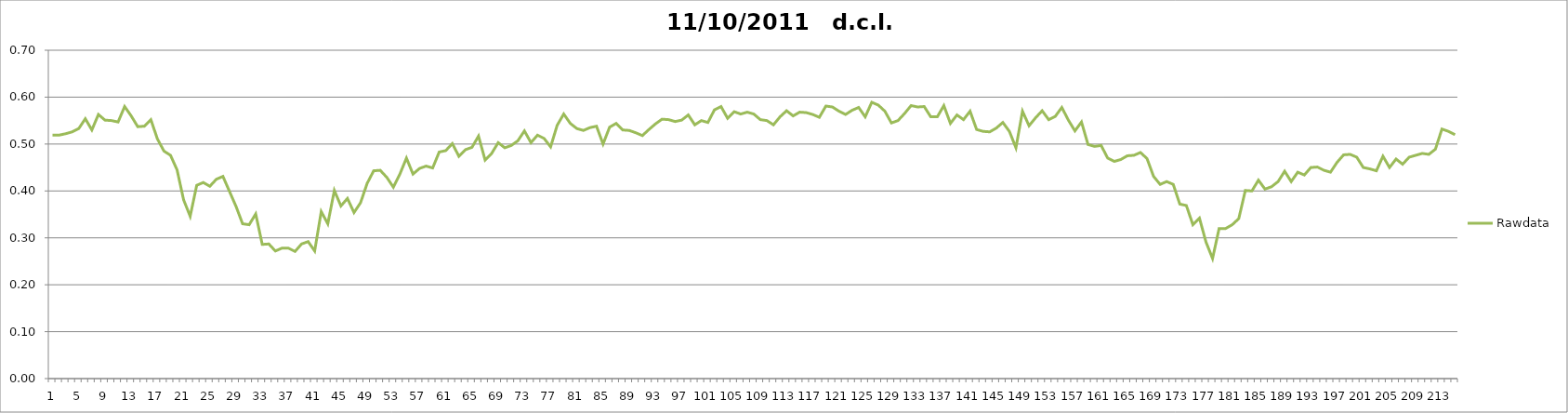
| Category | Rawdata |
|---|---|
| 0 | 0.519 |
| 1 | 0.519 |
| 2 | 0.522 |
| 3 | 0.526 |
| 4 | 0.533 |
| 5 | 0.554 |
| 6 | 0.53 |
| 7 | 0.563 |
| 8 | 0.551 |
| 9 | 0.55 |
| 10 | 0.547 |
| 11 | 0.58 |
| 12 | 0.56 |
| 13 | 0.537 |
| 14 | 0.538 |
| 15 | 0.552 |
| 16 | 0.511 |
| 17 | 0.485 |
| 18 | 0.476 |
| 19 | 0.445 |
| 20 | 0.381 |
| 21 | 0.346 |
| 22 | 0.412 |
| 23 | 0.418 |
| 24 | 0.41 |
| 25 | 0.425 |
| 26 | 0.431 |
| 27 | 0.399 |
| 28 | 0.367 |
| 29 | 0.33 |
| 30 | 0.328 |
| 31 | 0.351 |
| 32 | 0.286 |
| 33 | 0.287 |
| 34 | 0.272 |
| 35 | 0.278 |
| 36 | 0.278 |
| 37 | 0.271 |
| 38 | 0.287 |
| 39 | 0.292 |
| 40 | 0.272 |
| 41 | 0.356 |
| 42 | 0.33 |
| 43 | 0.401 |
| 44 | 0.368 |
| 45 | 0.384 |
| 46 | 0.354 |
| 47 | 0.375 |
| 48 | 0.416 |
| 49 | 0.443 |
| 50 | 0.444 |
| 51 | 0.429 |
| 52 | 0.408 |
| 53 | 0.436 |
| 54 | 0.47 |
| 55 | 0.436 |
| 56 | 0.448 |
| 57 | 0.453 |
| 58 | 0.449 |
| 59 | 0.483 |
| 60 | 0.486 |
| 61 | 0.501 |
| 62 | 0.474 |
| 63 | 0.488 |
| 64 | 0.493 |
| 65 | 0.517 |
| 66 | 0.466 |
| 67 | 0.48 |
| 68 | 0.503 |
| 69 | 0.492 |
| 70 | 0.497 |
| 71 | 0.507 |
| 72 | 0.528 |
| 73 | 0.503 |
| 74 | 0.519 |
| 75 | 0.512 |
| 76 | 0.494 |
| 77 | 0.54 |
| 78 | 0.564 |
| 79 | 0.544 |
| 80 | 0.533 |
| 81 | 0.529 |
| 82 | 0.535 |
| 83 | 0.538 |
| 84 | 0.5 |
| 85 | 0.536 |
| 86 | 0.544 |
| 87 | 0.53 |
| 88 | 0.529 |
| 89 | 0.524 |
| 90 | 0.518 |
| 91 | 0.531 |
| 92 | 0.543 |
| 93 | 0.553 |
| 94 | 0.552 |
| 95 | 0.548 |
| 96 | 0.551 |
| 97 | 0.562 |
| 98 | 0.541 |
| 99 | 0.55 |
| 100 | 0.546 |
| 101 | 0.573 |
| 102 | 0.58 |
| 103 | 0.555 |
| 104 | 0.569 |
| 105 | 0.564 |
| 106 | 0.568 |
| 107 | 0.564 |
| 108 | 0.552 |
| 109 | 0.55 |
| 110 | 0.541 |
| 111 | 0.558 |
| 112 | 0.571 |
| 113 | 0.56 |
| 114 | 0.568 |
| 115 | 0.567 |
| 116 | 0.563 |
| 117 | 0.557 |
| 118 | 0.581 |
| 119 | 0.579 |
| 120 | 0.57 |
| 121 | 0.563 |
| 122 | 0.572 |
| 123 | 0.578 |
| 124 | 0.558 |
| 125 | 0.589 |
| 126 | 0.583 |
| 127 | 0.57 |
| 128 | 0.545 |
| 129 | 0.55 |
| 130 | 0.565 |
| 131 | 0.582 |
| 132 | 0.579 |
| 133 | 0.58 |
| 134 | 0.558 |
| 135 | 0.558 |
| 136 | 0.582 |
| 137 | 0.544 |
| 138 | 0.562 |
| 139 | 0.552 |
| 140 | 0.57 |
| 141 | 0.531 |
| 142 | 0.527 |
| 143 | 0.526 |
| 144 | 0.534 |
| 145 | 0.546 |
| 146 | 0.527 |
| 147 | 0.492 |
| 148 | 0.57 |
| 149 | 0.539 |
| 150 | 0.556 |
| 151 | 0.571 |
| 152 | 0.552 |
| 153 | 0.559 |
| 154 | 0.578 |
| 155 | 0.551 |
| 156 | 0.528 |
| 157 | 0.547 |
| 158 | 0.499 |
| 159 | 0.495 |
| 160 | 0.497 |
| 161 | 0.47 |
| 162 | 0.463 |
| 163 | 0.467 |
| 164 | 0.475 |
| 165 | 0.476 |
| 166 | 0.482 |
| 167 | 0.469 |
| 168 | 0.431 |
| 169 | 0.414 |
| 170 | 0.42 |
| 171 | 0.414 |
| 172 | 0.372 |
| 173 | 0.369 |
| 174 | 0.328 |
| 175 | 0.342 |
| 176 | 0.291 |
| 177 | 0.256 |
| 178 | 0.32 |
| 179 | 0.32 |
| 180 | 0.328 |
| 181 | 0.341 |
| 182 | 0.401 |
| 183 | 0.4 |
| 184 | 0.423 |
| 185 | 0.404 |
| 186 | 0.409 |
| 187 | 0.42 |
| 188 | 0.442 |
| 189 | 0.42 |
| 190 | 0.44 |
| 191 | 0.434 |
| 192 | 0.45 |
| 193 | 0.451 |
| 194 | 0.444 |
| 195 | 0.44 |
| 196 | 0.461 |
| 197 | 0.477 |
| 198 | 0.478 |
| 199 | 0.472 |
| 200 | 0.45 |
| 201 | 0.447 |
| 202 | 0.443 |
| 203 | 0.474 |
| 204 | 0.45 |
| 205 | 0.468 |
| 206 | 0.457 |
| 207 | 0.472 |
| 208 | 0.476 |
| 209 | 0.48 |
| 210 | 0.478 |
| 211 | 0.489 |
| 212 | 0.532 |
| 213 | 0.527 |
| 214 | 0.52 |